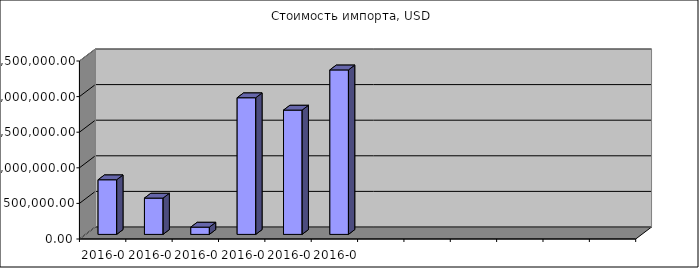
| Category | Стоимость импорта, USD |
|---|---|
| 2016-01 | 767343.87 |
| 2016-02 | 509892.08 |
| 2016-03 | 102277.28 |
| 2016-04 | 1919345.11 |
| 2016-05 | 1745760.41 |
| 2016-06 | 2310265.32 |